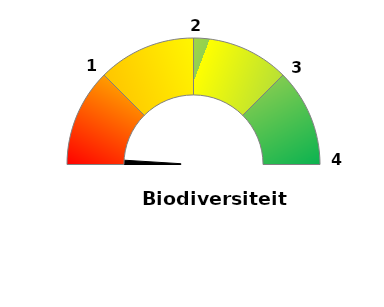
| Category | Variable | Fixe |
|---|---|---|
| 0.0 | 0 | 0 |
| 1.0 | 0.01 | 25 |
| 2.0 | 0 | 25 |
| 3.0 | 0 | 25 |
| 4.0 | 0 | 25 |
| 5.0 | 1 | 100 |